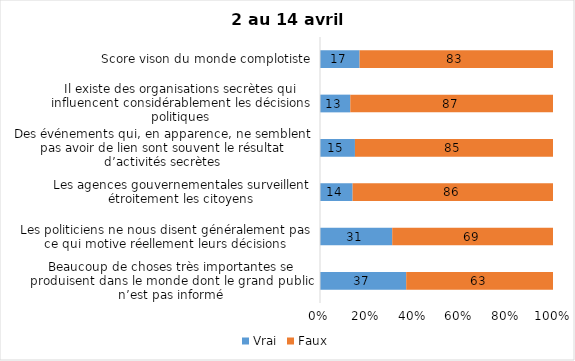
| Category | Vrai | Faux |
|---|---|---|
| Beaucoup de choses très importantes se produisent dans le monde dont le grand public n’est pas informé | 37 | 63 |
| Les politiciens ne nous disent généralement pas ce qui motive réellement leurs décisions | 31 | 69 |
| Les agences gouvernementales surveillent étroitement les citoyens | 14 | 86 |
| Des événements qui, en apparence, ne semblent pas avoir de lien sont souvent le résultat d’activités secrètes | 15 | 85 |
| Il existe des organisations secrètes qui influencent considérablement les décisions politiques | 13 | 87 |
| Score vison du monde complotiste | 17 | 83 |